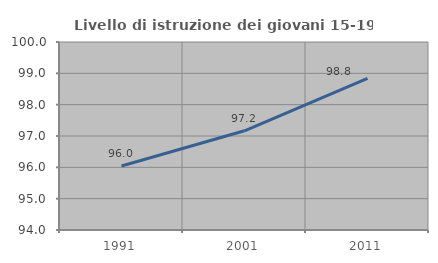
| Category | Livello di istruzione dei giovani 15-19 anni |
|---|---|
| 1991.0 | 96.044 |
| 2001.0 | 97.167 |
| 2011.0 | 98.837 |